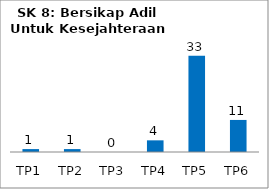
| Category | Bil Pel |
|---|---|
| TP1 | 1 |
| TP2 | 1 |
| TP3 | 0 |
| TP4 | 4 |
| TP5 | 33 |
| TP6 | 11 |